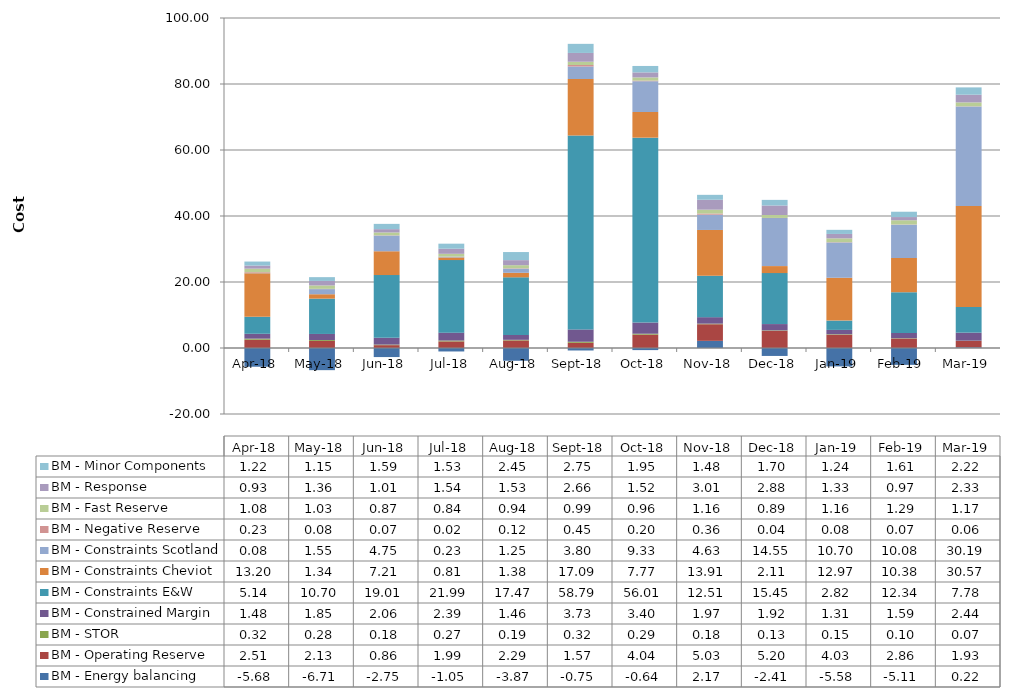
| Category | BM - Energy balancing | BM - Operating Reserve | BM - STOR | BM - Constrained Margin | BM - Constraints E&W | BM - Constraints Cheviot | BM - Constraints Scotland | BM - Negative Reserve | BM - Fast Reserve | BM - Response | BM - Minor Components |
|---|---|---|---|---|---|---|---|---|---|---|---|
| 2018-04-30 | -5.679 | 2.511 | 0.323 | 1.476 | 5.145 | 13.203 | 0.08 | 0.229 | 1.077 | 0.933 | 1.22 |
| 2018-05-31 | -6.713 | 2.133 | 0.276 | 1.848 | 10.699 | 1.338 | 1.549 | 0.084 | 1.033 | 1.364 | 1.149 |
| 2018-06-30 | -2.748 | 0.863 | 0.175 | 2.058 | 19.009 | 7.211 | 4.754 | 0.075 | 0.865 | 1.008 | 1.595 |
| 2018-07-31 | -1.051 | 1.994 | 0.266 | 2.394 | 21.988 | 0.809 | 0.234 | 0.017 | 0.842 | 1.545 | 1.526 |
| 2018-08-31 | -3.871 | 2.288 | 0.19 | 1.458 | 17.475 | 1.378 | 1.253 | 0.119 | 0.937 | 1.529 | 2.451 |
| 2018-09-30 | -0.753 | 1.572 | 0.325 | 3.731 | 58.793 | 17.087 | 3.801 | 0.452 | 0.989 | 2.663 | 2.755 |
| 2018-10-31 | -0.638 | 4.041 | 0.285 | 3.398 | 56.012 | 7.774 | 9.332 | 0.197 | 0.959 | 1.523 | 1.945 |
| 2018-11-30 | 2.169 | 5.033 | 0.178 | 1.968 | 12.512 | 13.908 | 4.626 | 0.361 | 1.16 | 3.014 | 1.483 |
| 2018-12-31 | -2.407 | 5.204 | 0.132 | 1.915 | 15.454 | 2.113 | 14.55 | 0.044 | 0.894 | 2.879 | 1.7 |
| 2019-01-31 | -5.578 | 4.026 | 0.151 | 1.309 | 2.825 | 12.974 | 10.698 | 0.082 | 1.162 | 1.334 | 1.244 |
| 2019-02-28 | -5.109 | 2.864 | 0.105 | 1.59 | 12.342 | 10.375 | 10.077 | 0.072 | 1.291 | 0.965 | 1.612 |
| 2019-03-31 | 0.216 | 1.929 | 0.069 | 2.435 | 7.781 | 30.565 | 30.191 | 0.065 | 1.172 | 2.333 | 2.216 |